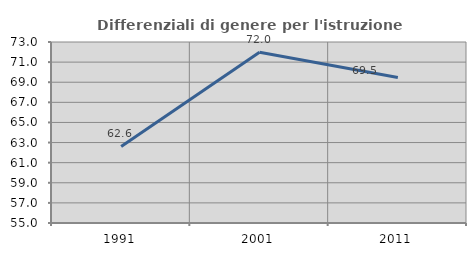
| Category | Differenziali di genere per l'istruzione superiore |
|---|---|
| 1991.0 | 62.614 |
| 2001.0 | 71.988 |
| 2011.0 | 69.47 |